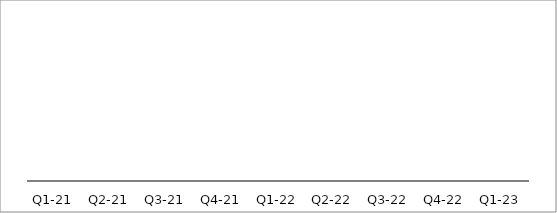
| Category | Revenue |
|---|---|
| Q1-21 | 0 |
| Q2-21 | 0 |
| Q3-21 | 0 |
| Q4-21 | 0 |
| Q1-22 | 0 |
| Q2-22 | 0 |
| Q3-22 | 0 |
| Q4-22 | 0 |
| Q1-23 | 0 |